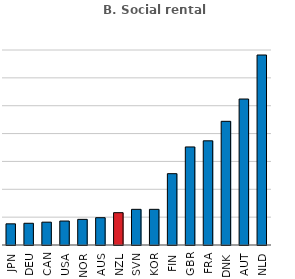
| Category | Series 0 |
|---|---|
| JPN | 3.8 |
| DEU | 3.9 |
| CAN | 4.1 |
| USA | 4.3 |
| NOR | 4.6 |
| AUS | 4.9 |
| NZL | 5.8 |
| SVN | 6.4 |
| KOR | 6.4 |
| FIN | 12.8 |
| GBR | 17.6 |
| FRA | 18.7 |
| DNK | 22.2 |
| AUT | 26.2 |
| NLD | 34.1 |